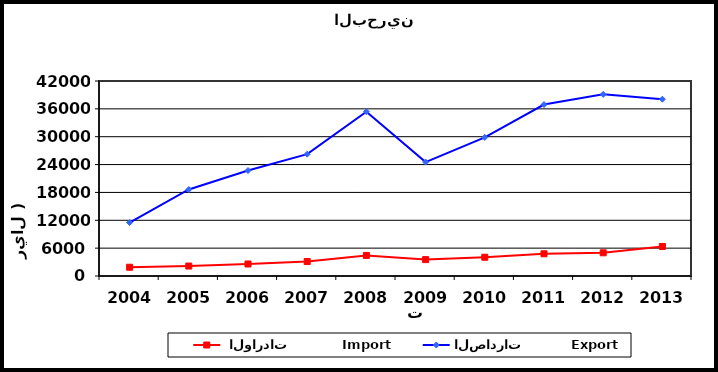
| Category |  الواردات           Import | الصادرات          Export |
|---|---|---|
| 2004.0 | 1885 | 11507 |
| 2005.0 | 2146 | 18637 |
| 2006.0 | 2585 | 22717 |
| 2007.0 | 3116 | 26238 |
| 2008.0 | 4429 | 35389 |
| 2009.0 | 3530 | 24534 |
| 2010.0 | 4044 | 29849 |
| 2011.0 | 4780 | 36935 |
| 2012.0 | 4996 | 39121 |
| 2013.0 | 6360 | 38081 |